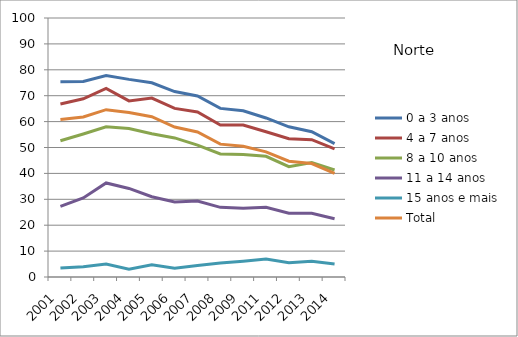
| Category | 0 a 3 anos | 4 a 7 anos | 8 a 10 anos | 11 a 14 anos | 15 anos e mais | Total |
|---|---|---|---|---|---|---|
| 2001.0 | 75.4 | 66.8 | 52.6 | 27.3 | 3.5 | 60.8 |
| 2002.0 | 75.5 | 68.8 | 55.2 | 30.5 | 4 | 61.8 |
| 2003.0 | 77.8 | 72.8 | 58 | 36.3 | 5 | 64.6 |
| 2004.0 | 76.3 | 68 | 57.3 | 34.2 | 3 | 63.5 |
| 2005.0 | 75 | 69.1 | 55.3 | 31 | 4.7 | 61.9 |
| 2006.0 | 71.6 | 65.1 | 53.7 | 29 | 3.4 | 57.9 |
| 2007.0 | 69.9 | 63.7 | 50.9 | 29.3 | 4.4 | 56 |
| 2008.0 | 65.1 | 58.7 | 47.5 | 26.9 | 5.4 | 51.3 |
| 2009.0 | 64.2 | 58.7 | 47.3 | 26.5 | 6.1 | 50.5 |
| 2011.0 | 61.4 | 56.1 | 46.6 | 26.9 | 6.9 | 48.3 |
| 2012.0 | 58 | 53.4 | 42.6 | 24.6 | 5.5 | 44.7 |
| 2013.0 | 56.1 | 53 | 44.2 | 24.6 | 6.1 | 43.8 |
| 2014.0 | 51.5 | 49.5 | 41.3 | 22.5 | 5 | 40 |